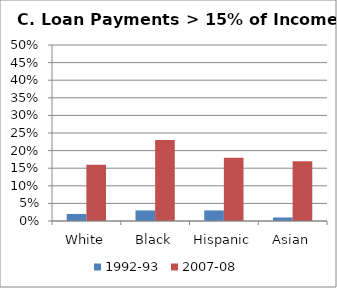
| Category | 1992-93 | 2007-08 |
|---|---|---|
| White | 2 | 16 |
| Black | 3 | 23 |
| Hispanic | 3 | 18 |
| Asian | 1 | 17 |